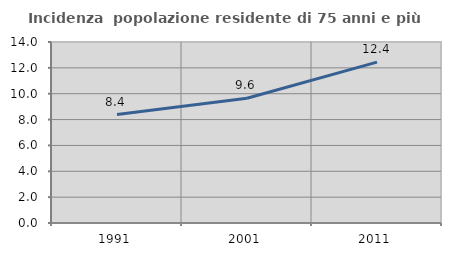
| Category | Incidenza  popolazione residente di 75 anni e più |
|---|---|
| 1991.0 | 8.391 |
| 2001.0 | 9.644 |
| 2011.0 | 12.442 |